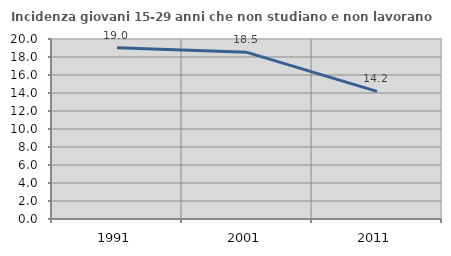
| Category | Incidenza giovani 15-29 anni che non studiano e non lavorano  |
|---|---|
| 1991.0 | 19.027 |
| 2001.0 | 18.519 |
| 2011.0 | 14.184 |